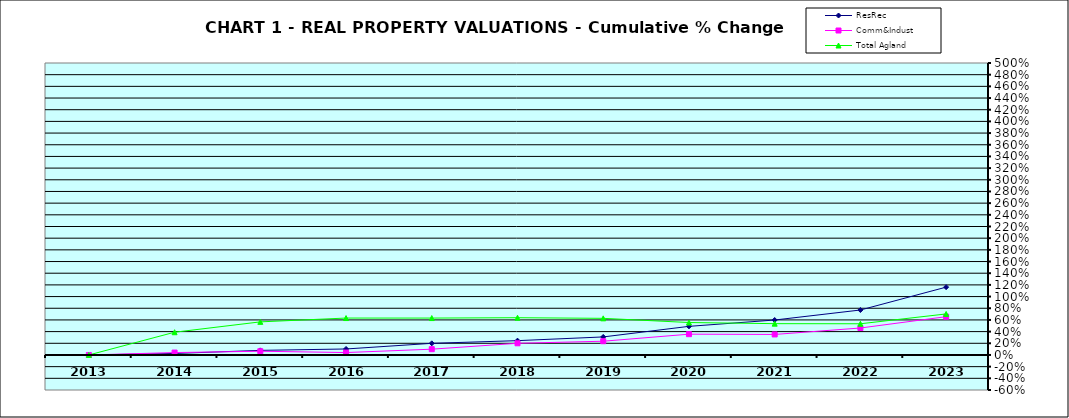
| Category | ResRec | Comm&Indust | Total Agland |
|---|---|---|---|
| 2013.0 | 0 | 0 | 0 |
| 2014.0 | 0.026 | 0.041 | 0.389 |
| 2015.0 | 0.079 | 0.064 | 0.567 |
| 2016.0 | 0.102 | 0.041 | 0.632 |
| 2017.0 | 0.199 | 0.099 | 0.632 |
| 2018.0 | 0.245 | 0.2 | 0.638 |
| 2019.0 | 0.309 | 0.235 | 0.627 |
| 2020.0 | 0.49 | 0.356 | 0.556 |
| 2021.0 | 0.598 | 0.351 | 0.536 |
| 2022.0 | 0.77 | 0.462 | 0.534 |
| 2023.0 | 1.162 | 0.656 | 0.703 |